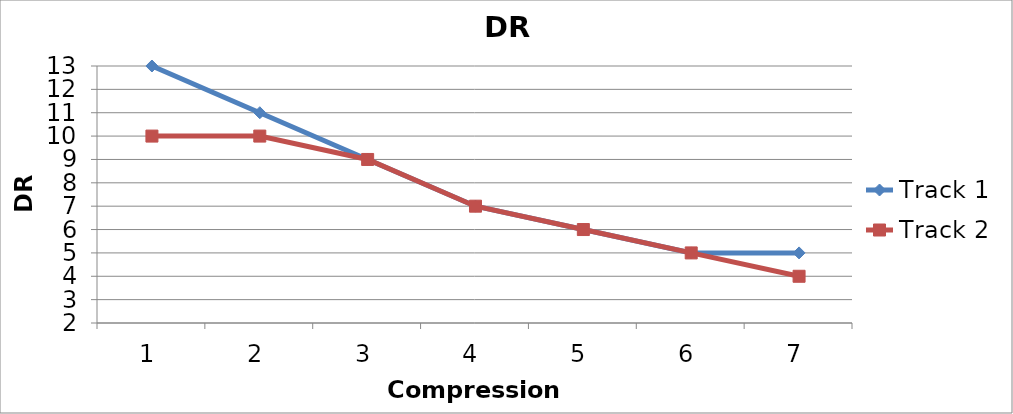
| Category | Track 1 | Track 2 |
|---|---|---|
| 0 | 13 | 10 |
| 1 | 11 | 10 |
| 2 | 9 | 9 |
| 3 | 7 | 7 |
| 4 | 6 | 6 |
| 5 | 5 | 5 |
| 6 | 5 | 4 |